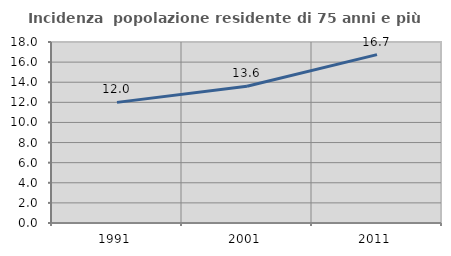
| Category | Incidenza  popolazione residente di 75 anni e più |
|---|---|
| 1991.0 | 11.996 |
| 2001.0 | 13.596 |
| 2011.0 | 16.742 |